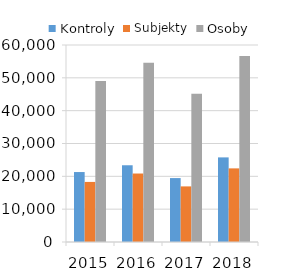
| Category | Kontroly | Subjekty | Osoby |
|---|---|---|---|
| 2015.0 | 21309 | 18298 | 49014 |
| 2016.0 | 23372 | 20857 | 54603 |
| 2017.0 | 19469 | 16935 | 45130 |
| 2018.0 | 25769 | 22423 | 56636 |